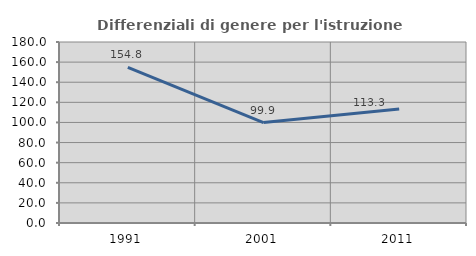
| Category | Differenziali di genere per l'istruzione superiore |
|---|---|
| 1991.0 | 154.809 |
| 2001.0 | 99.895 |
| 2011.0 | 113.271 |